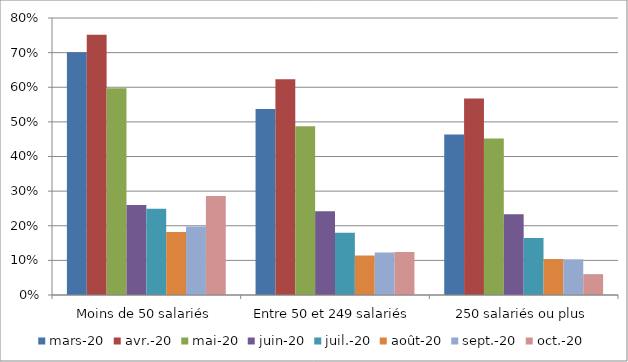
| Category | mars-20 | avr.-20 | mai-20 | juin-20 | juil.-20 | août-20 | sept.-20 | oct.-20 |
|---|---|---|---|---|---|---|---|---|
| Moins de 50 salariés | 0.701 | 0.752 | 0.597 | 0.26 | 0.249 | 0.182 | 0.198 | 0.286 |
| Entre 50 et 249 salariés | 0.537 | 0.623 | 0.488 | 0.242 | 0.18 | 0.114 | 0.123 | 0.124 |
| 250 salariés ou plus | 0.464 | 0.567 | 0.452 | 0.233 | 0.165 | 0.104 | 0.103 | 0.06 |